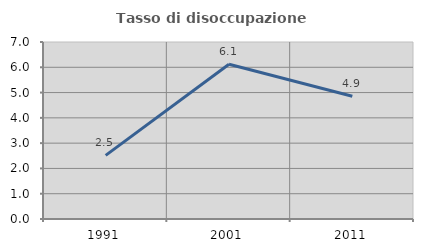
| Category | Tasso di disoccupazione giovanile  |
|---|---|
| 1991.0 | 2.516 |
| 2001.0 | 6.122 |
| 2011.0 | 4.854 |